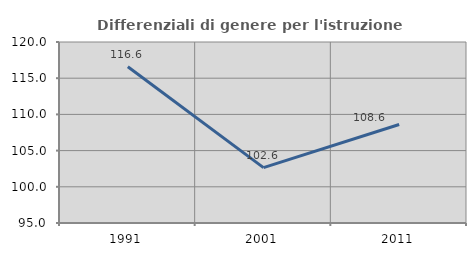
| Category | Differenziali di genere per l'istruzione superiore |
|---|---|
| 1991.0 | 116.571 |
| 2001.0 | 102.646 |
| 2011.0 | 108.601 |